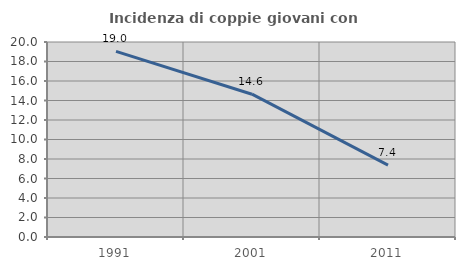
| Category | Incidenza di coppie giovani con figli |
|---|---|
| 1991.0 | 19.035 |
| 2001.0 | 14.646 |
| 2011.0 | 7.375 |